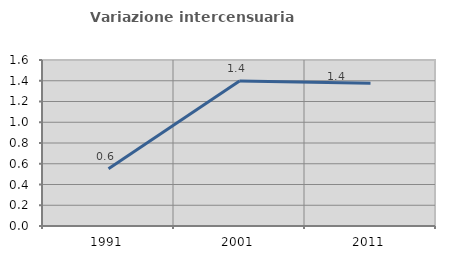
| Category | Variazione intercensuaria annua |
|---|---|
| 1991.0 | 0.551 |
| 2001.0 | 1.398 |
| 2011.0 | 1.376 |